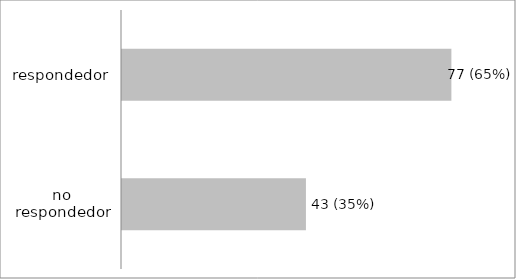
| Category | Series 0 |
|---|---|
| no respondedor | 43 |
| respondedor | 77 |